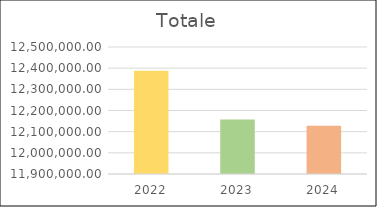
| Category | Series 0 |
|---|---|
| 2022.0 | 12387716 |
| 2023.0 | 12157908 |
| 2024.0 | 12127908 |